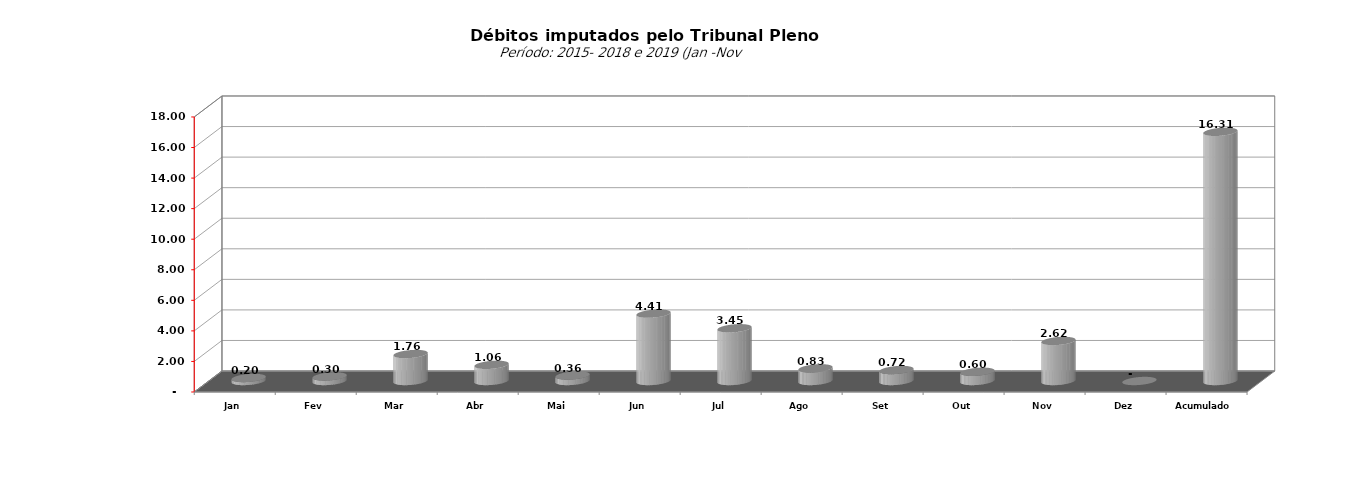
| Category |  7.073.154,74   5.749.129,25   4.727.033,51   16.081.820,48   21.535.723,60   8.578.266,09   25.676.499,17   10.592.915,18   197.255,77   296.375,09   1.764.671,00   1.058.511,33   358.973,08   4.409.150,19   3.450.817,21   826.867,37   718.665,59   604.8 |
|---|---|
| Jan | 197255.77 |
| Fev | 296375.09 |
| Mar | 1764671 |
| Abr | 1058511.33 |
| Mai | 358973.08 |
| Jun | 4409150.19 |
| Jul | 3450817.21 |
| Ago | 826867.37 |
| Set | 718665.59 |
| Out | 604869.83 |
| Nov | 2620907.28 |
| Dez | 0 |
| Acumulado | 16307063.74 |